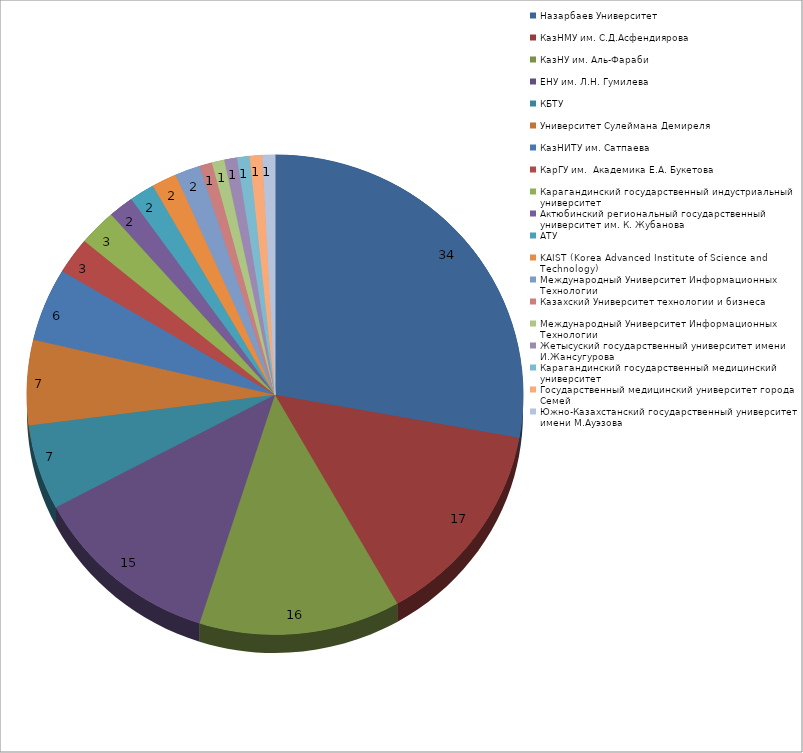
| Category | Series 0 |
|---|---|
| Назарбаев Университет | 34 |
| КазНМУ им. С.Д.Асфендиярова  | 17 |
| КазНУ им. Аль-Фараби | 16 |
| ЕНУ им. Л.Н. Гумилева | 15 |
| КБТУ | 7 |
| Университет Сулеймана Демиреля | 7 |
| КазНИТУ им. Сатпаева | 6 |
| КарГУ им.  Академика Е.А. Букетова | 3 |
| Карагандинский государственный индустриальный университет | 3 |
| Актюбинский региональный государственный университет им. К. Жубанова | 2 |
| АТУ | 2 |
| KAIST (Korea Advanced Institute of Science and Technology) | 2 |
| Международный Университет Информационных Технологии | 2 |
| Казахский Университет технологии и бизнеса | 1 |
| Международный Университет Информационных Технологии | 1 |
| Жетысуский государственный университет имени И.Жансугурова | 1 |
| Карагандинский государственный медицинский университет | 1 |
| Государственный медицинский университет города Семей | 1 |
| Южно-Казахстанский государственный университет имени М.Ауэзова | 1 |